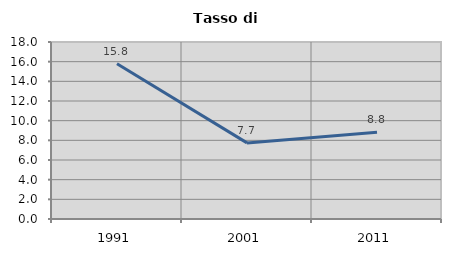
| Category | Tasso di disoccupazione   |
|---|---|
| 1991.0 | 15.789 |
| 2001.0 | 7.739 |
| 2011.0 | 8.812 |